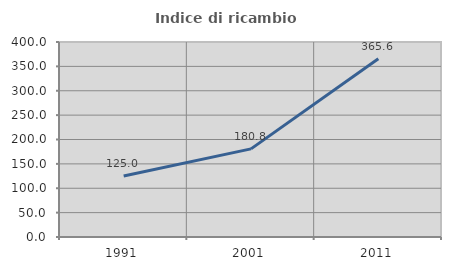
| Category | Indice di ricambio occupazionale  |
|---|---|
| 1991.0 | 125 |
| 2001.0 | 180.769 |
| 2011.0 | 365.625 |